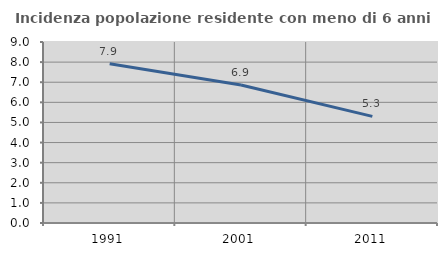
| Category | Incidenza popolazione residente con meno di 6 anni |
|---|---|
| 1991.0 | 7.917 |
| 2001.0 | 6.859 |
| 2011.0 | 5.301 |